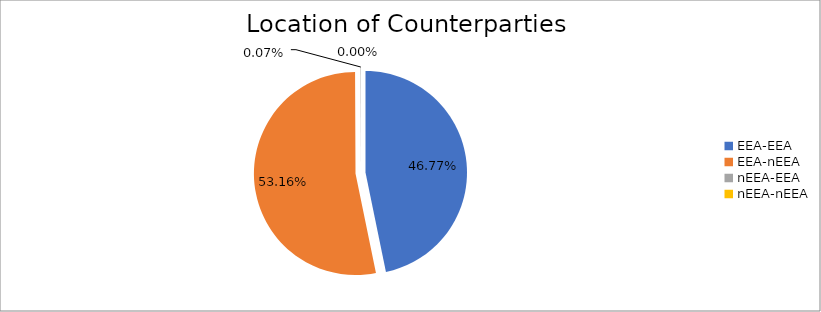
| Category | Series 0 |
|---|---|
| EEA-EEA | 5982530.651 |
| EEA-nEEA | 6800491.619 |
| nEEA-EEA | 8658.989 |
| nEEA-nEEA | 70.639 |